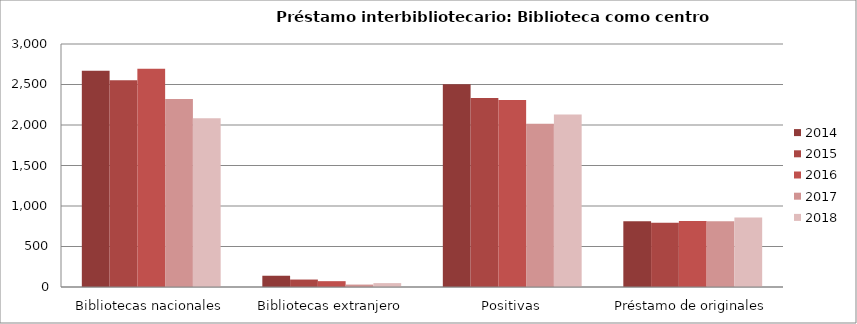
| Category | 2014 | 2015 | 2016 | 2017 | 2018 |
|---|---|---|---|---|---|
| Bibliotecas nacionales | 2669 | 2554 | 2693 | 2320 | 2082 |
| Bibliotecas extranjero | 139 | 92 | 72 | 30 | 48 |
| Positivas | 2503 | 2333 | 2309 | 2015 | 2130 |
| Préstamo de originales | 813 | 792 | 815 | 812 | 857 |